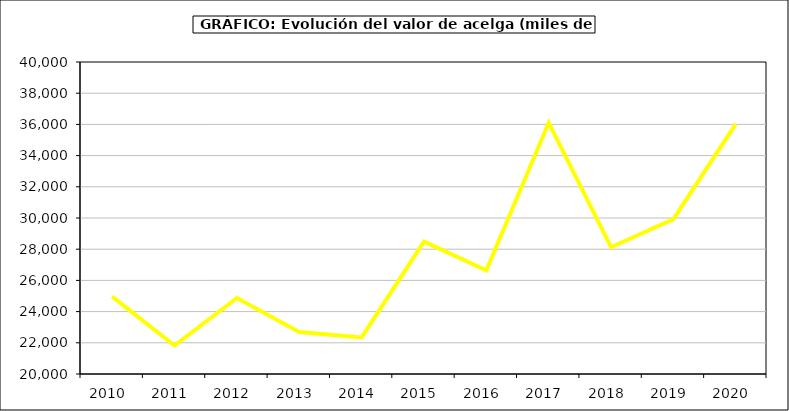
| Category | Valor |
|---|---|
| 2010.0 | 24959.936 |
| 2011.0 | 21822.946 |
| 2012.0 | 24870.933 |
| 2013.0 | 22693.234 |
| 2014.0 | 22344.648 |
| 2015.0 | 28487 |
| 2016.0 | 26648 |
| 2017.0 | 36102.37 |
| 2018.0 | 28124.995 |
| 2019.0 | 29932.874 |
| 2020.0 | 36031.954 |